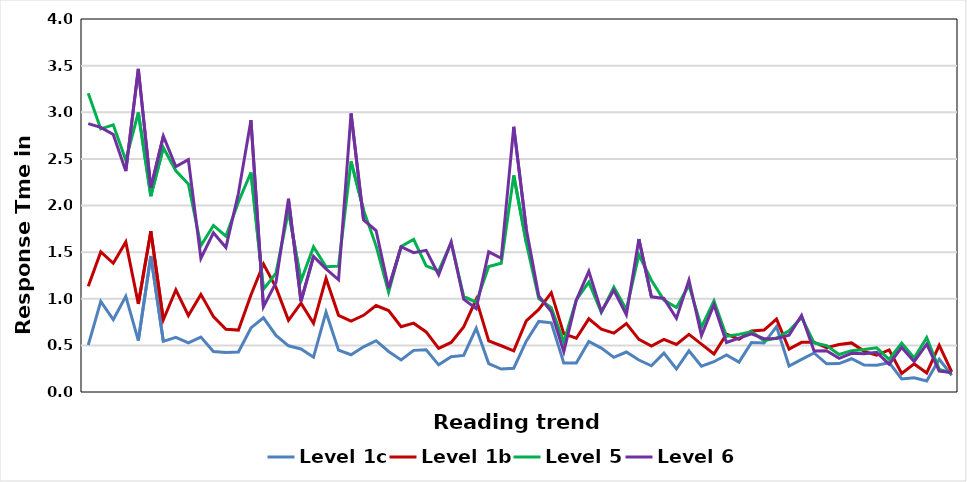
| Category | Level 1c | Level 1b | Level 5 | Level 6 |
|---|---|---|---|---|
| CR220Q01T | 0.504 | 1.133 | 3.203 | 2.878 |
| CR404Q10T | 0.971 | 1.502 | 2.821 | 2.838 |
| CR219Q01T | 0.776 | 1.381 | 2.866 | 2.762 |
| CR466Q02T | 1.026 | 1.61 | 2.485 | 2.369 |
| CR111Q02BT | 0.552 | 0.945 | 2.997 | 3.465 |
| CR455Q02T | 1.459 | 1.724 | 2.1 | 2.189 |
| CR412Q08T | 0.544 | 0.775 | 2.62 | 2.744 |
| CR460Q01T | 0.586 | 1.096 | 2.372 | 2.417 |
| CR111Q06T | 0.527 | 0.82 | 2.23 | 2.491 |
| CR437Q01T | 0.589 | 1.047 | 1.568 | 1.433 |
| CR420Q10T | 0.434 | 0.809 | 1.786 | 1.708 |
| CR111Q01T | 0.424 | 0.672 | 1.671 | 1.55 |
| CR102Q04T | 0.43 | 0.664 | 2.039 | 2.131 |
| CR067Q04T | 0.687 | 1.041 | 2.354 | 2.915 |
| CR104Q01T | 0.796 | 1.374 | 1.1 | 0.914 |
| CR227Q06T | 0.607 | 1.122 | 1.275 | 1.173 |
| CR104Q05T | 0.496 | 0.769 | 1.943 | 2.072 |
| CR067Q01T | 0.461 | 0.953 | 1.193 | 0.973 |
| CR055Q01T | 0.374 | 0.736 | 1.556 | 1.453 |
| CR420Q02T | 0.856 | 1.218 | 1.344 | 1.32 |
| CR424Q02T | 0.449 | 0.823 | 1.349 | 1.203 |
| CR067Q05T | 0.4 | 0.759 | 2.472 | 2.987 |
| CR055Q02T | 0.484 | 0.822 | 1.95 | 1.845 |
| CR437Q07T | 0.55 | 0.928 | 1.568 | 1.732 |
| CR406Q01T | 0.435 | 0.874 | 1.073 | 1.112 |
| CR055Q03T | 0.343 | 0.7 | 1.561 | 1.557 |
| CR453Q04T | 0.446 | 0.738 | 1.636 | 1.495 |
| CR055Q05T | 0.452 | 0.644 | 1.353 | 1.519 |
| CR227Q03T | 0.291 | 0.469 | 1.298 | 1.258 |
| CR432Q06T | 0.378 | 0.532 | 1.602 | 1.609 |
| CR220Q02T | 0.392 | 0.698 | 1.025 | 0.996 |
| CR455Q03T | 0.683 | 0.993 | 0.961 | 0.894 |
| CR432Q05T | 0.305 | 0.548 | 1.346 | 1.503 |
| CR406Q02T | 0.246 | 0.496 | 1.381 | 1.434 |
| CR420Q06T | 0.255 | 0.441 | 2.323 | 2.844 |
| CR446Q06T | 0.545 | 0.763 | 1.602 | 1.75 |
| CR432Q01T | 0.756 | 0.886 | 1.002 | 1.03 |
| CR456Q02T | 0.741 | 1.065 | 0.904 | 0.862 |
| CR404Q03T | 0.31 | 0.623 | 0.536 | 0.433 |
| CR406Q05T | 0.31 | 0.577 | 0.989 | 0.986 |
| CR456Q06T | 0.541 | 0.784 | 1.178 | 1.294 |
| CR466Q03T | 0.471 | 0.673 | 0.854 | 0.864 |
| CR453Q06T | 0.371 | 0.631 | 1.123 | 1.091 |
| CR404Q07T | 0.429 | 0.733 | 0.886 | 0.829 |
| CR219Q02T | 0.343 | 0.564 | 1.471 | 1.64 |
| CR453Q01T | 0.281 | 0.493 | 1.198 | 1.021 |
| CR104Q02T | 0.417 | 0.565 | 0.986 | 1.004 |
| CR102Q05T | 0.247 | 0.51 | 0.907 | 0.79 |
| CR227Q02T | 0.442 | 0.618 | 1.145 | 1.201 |
| CR404Q06T | 0.277 | 0.513 | 0.695 | 0.606 |
| CR412Q06T | 0.325 | 0.407 | 0.976 | 0.935 |
| CR220Q04T | 0.397 | 0.621 | 0.598 | 0.531 |
| CR424Q03T | 0.32 | 0.566 | 0.618 | 0.578 |
| CR455Q05T | 0.53 | 0.654 | 0.647 | 0.624 |
| CR446Q03T | 0.525 | 0.664 | 0.55 | 0.572 |
| CR466Q06T | 0.701 | 0.782 | 0.578 | 0.574 |
| CR453Q05T | 0.279 | 0.461 | 0.656 | 0.61 |
| CR456Q01T | 0.35 | 0.533 | 0.8 | 0.821 |
| CR420Q09T | 0.419 | 0.534 | 0.527 | 0.441 |
| CR412Q05T | 0.303 | 0.476 | 0.497 | 0.443 |
| CR424Q07T | 0.305 | 0.509 | 0.402 | 0.361 |
| CR220Q06T | 0.357 | 0.527 | 0.443 | 0.415 |
| CR455Q04T | 0.289 | 0.436 | 0.455 | 0.41 |
| CR437Q06T | 0.287 | 0.394 | 0.473 | 0.425 |
| CR412Q01T | 0.314 | 0.451 | 0.351 | 0.299 |
| CR460Q06T | 0.14 | 0.198 | 0.524 | 0.478 |
| CR227Q01T | 0.153 | 0.301 | 0.364 | 0.325 |
| CR460Q05T | 0.118 | 0.205 | 0.585 | 0.513 |
| CR220Q05T | 0.351 | 0.5 | 0.243 | 0.224 |
| CR102Q07T | 0.179 | 0.216 | 0.201 | 0.209 |